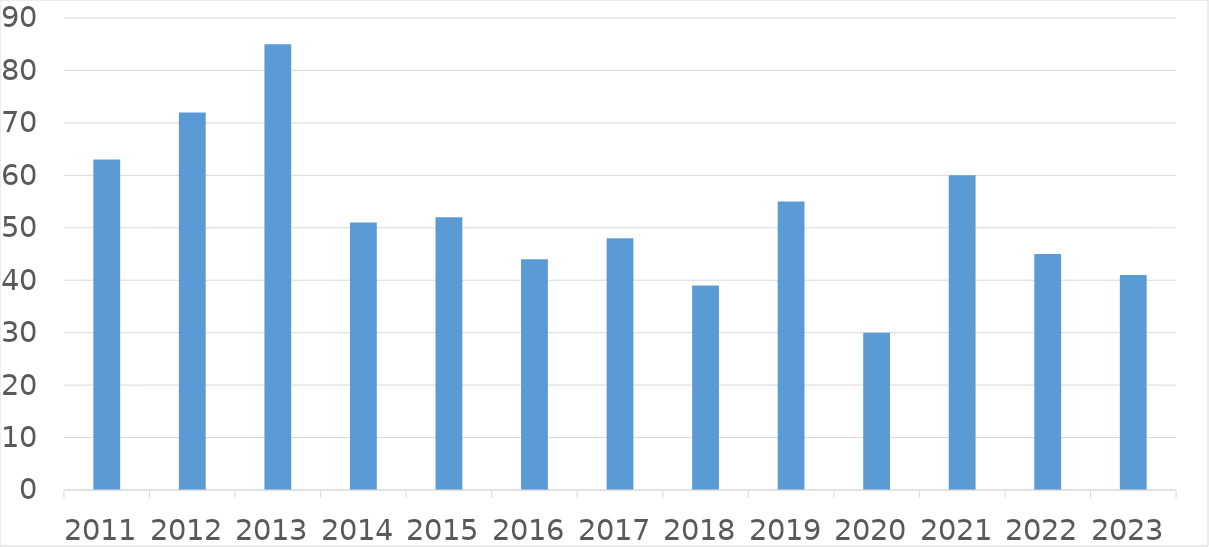
| Category | Series 0 |
|---|---|
| 2011 | 63 |
| 2012 | 72 |
| 2013 | 85 |
| 2014 | 51 |
| 2015 | 52 |
| 2016 | 44 |
| 2017 | 48 |
| 2018 | 39 |
| 2019 | 55 |
| 2020 | 30 |
| 2021 | 60 |
| 2022 | 45 |
| 2023 | 41 |